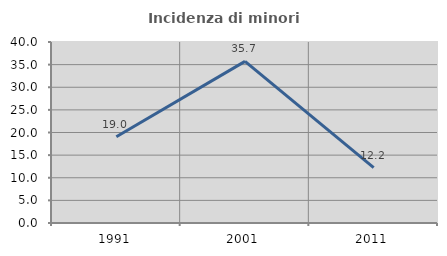
| Category | Incidenza di minori stranieri |
|---|---|
| 1991.0 | 19.048 |
| 2001.0 | 35.714 |
| 2011.0 | 12.245 |